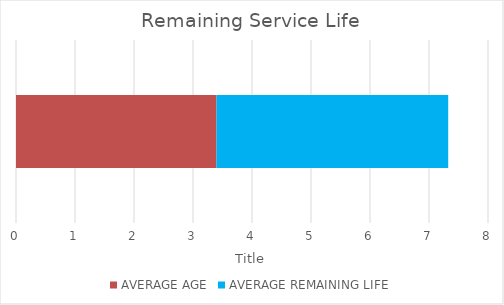
| Category | AVERAGE AGE | AVERAGE REMAINING LIFE |
|---|---|---|
| BACKLOG % OF TOTAL ASSET VALUE | 3.398 | 3.927 |